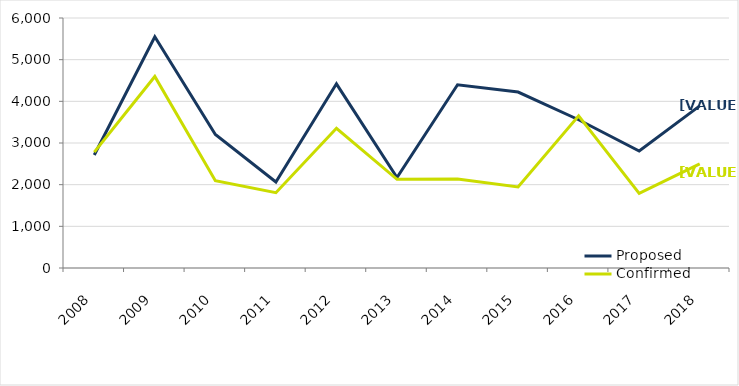
| Category | Proposed | Confirmed |
|---|---|---|
| 2008 | 2713 | 2782 |
| 2009 | 5548 | 4596 |
| 2010 | 3205 | 2096 |
| 2011 | 2064 | 1808 |
| 2012 | 4420 | 3353 |
| 2013 | 2172 | 2129 |
| 2014 | 4397 | 2136 |
| 2015 | 4222 | 1946 |
| 2016 | 3558 | 3653 |
| 2017 | 2807 | 1790 |
| 2018 | 3891 | 2498 |